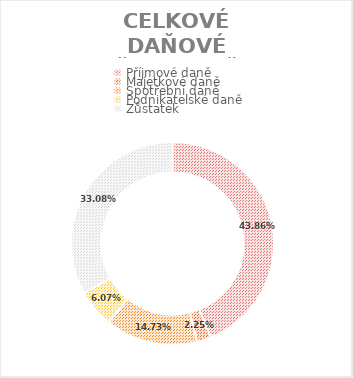
| Category | CELKOVÉ DAŇOVÉ BŘEMENO ČR:  |
|---|---|
| 0 | 0.439 |
| 1 | 0.023 |
| 2 | 0.147 |
| 3 | 0.061 |
| 4 | 0.331 |